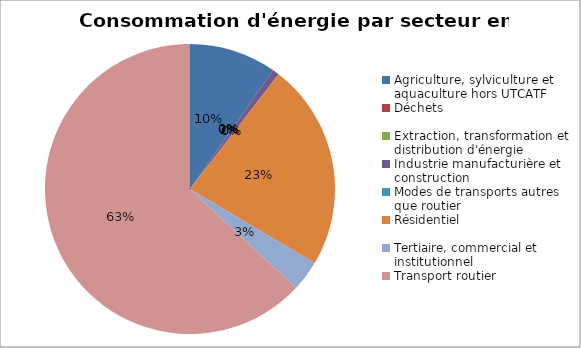
| Category | Series 0 |
|---|---|
| Agriculture, sylviculture et aquaculture hors UTCATF | 25079.582 |
| Déchets | 0 |
| Extraction, transformation et distribution d'énergie | 0 |
| Industrie manufacturière et construction | 1886.426 |
| Modes de transports autres que routier | 0 |
| Résidentiel | 59456.126 |
| Tertiaire, commercial et institutionnel | 8834.582 |
| Transport routier | 162486.792 |